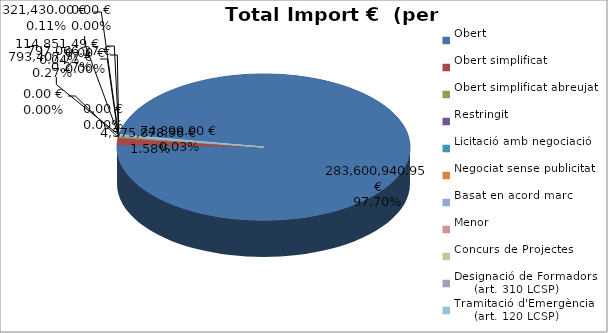
| Category | Total preu
(amb IVA) |
|---|---|
| Obert | 283600940.945 |
| Obert simplificat | 4575878.962 |
| Obert simplificat abreujat | 74899 |
| Restringit | 0 |
| Licitació amb negociació | 0 |
| Negociat sense publicitat | 793407.769 |
| Basat en acord marc | 321430 |
| Menor | 114851.486 |
| Concurs de Projectes | 0 |
| Designació de Formadors
     (art. 310 LCSP) | 0 |
| Tramitació d'Emergència
     (art. 120 LCSP) | 797066.373 |